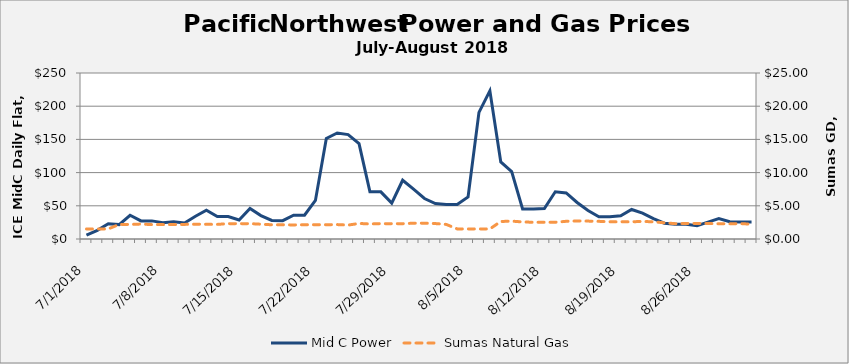
| Category | Mid C Power |
|---|---|
| 0 | 5.78 |
| 1 | 12.987 |
| 2 | 22.94 |
| 3 | 21.71 |
| 4 | 35.777 |
| 5 | 27.27 |
| 6 | 27.27 |
| 7 | 24.38 |
| 8 | 25.86 |
| 9 | 24.083 |
| 10 | 34.297 |
| 11 | 43.407 |
| 12 | 33.85 |
| 13 | 33.85 |
| 14 | 28.72 |
| 15 | 45.853 |
| 16 | 35.23 |
| 17 | 27.917 |
| 18 | 27.667 |
| 19 | 35.913 |
| 20 | 35.913 |
| 21 | 58.09 |
| 22 | 151.323 |
| 23 | 159.7 |
| 24 | 157.237 |
| 25 | 143.577 |
| 26 | 70.987 |
| 27 | 70.987 |
| 28 | 54.09 |
| 29 | 88.497 |
| 30 | 75.087 |
| 31 | 60.987 |
| 32 | 53.48 |
| 33 | 51.853 |
| 34 | 51.853 |
| 35 | 63.29 |
| 36 | 190.637 |
| 37 | 223.117 |
| 38 | 115.973 |
| 39 | 101.66 |
| 40 | 45.277 |
| 41 | 45.277 |
| 42 | 45.95 |
| 43 | 71.13 |
| 44 | 69.41 |
| 45 | 54.997 |
| 46 | 42.837 |
| 47 | 33.473 |
| 48 | 33.473 |
| 49 | 34.91 |
| 50 | 44.497 |
| 51 | 39.043 |
| 52 | 30.66 |
| 53 | 23.847 |
| 54 | 22.14 |
| 55 | 22.14 |
| 56 | 20.11 |
| 57 | 25.47 |
| 58 | 30.737 |
| 59 | 25.987 |
| 60 | 25.763 |
| 61 | 25.763 |